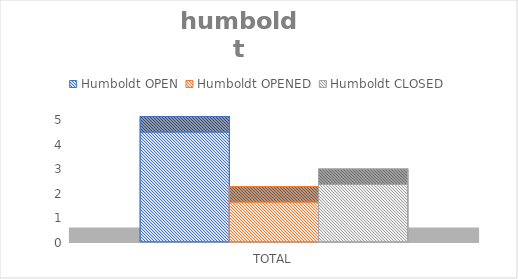
| Category | Humboldt |
|---|---|
| TOTAL | 2.341 |